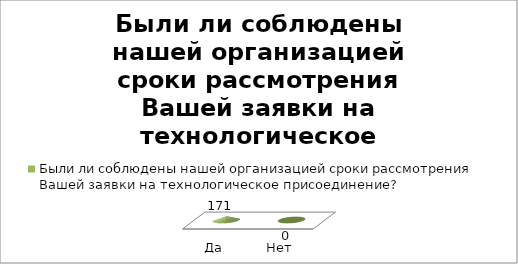
| Category | Были ли соблюдены нашей организацией сроки рассмотрения Вашей заявки на технологическое присоединение? |
|---|---|
| Да | 171 |
| Нет | 0 |